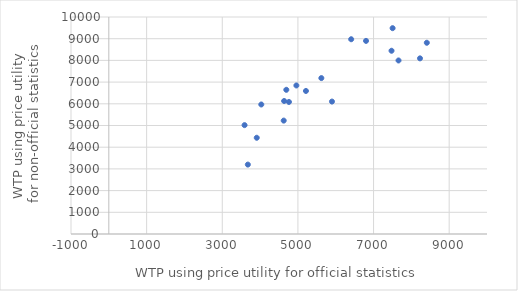
| Category | Series 0 |
|---|---|
| 4624.746085600304 | 5225.88 |
| 3911.6695905452307 | 4435.017 |
| 5900.867249253374 | 6103.217 |
| 4762.731070256099 | 6084.536 |
| 4635.849263185604 | 6128.985 |
| 5212.364453039598 | 6591.582 |
| 5619.855401473628 | 7184.896 |
| 7475.496682473595 | 8444.701 |
| 4031.7217765683854 | 5968.187 |
| 3589.3833462560515 | 5017.13 |
| 7660.616102369655 | 7996.941 |
| 6801.298396705039 | 8899.195 |
| 8408.52076374748 | 8813.107 |
| 4959.605618757788 | 6844.917 |
| 8228.26788636871 | 8094.342 |
| 6408.49581903948 | 8975.076 |
| 7504.11314232619 | 9485.201 |
| 4693.296839805444 | 6644.969 |
| 3676.12544335565 | 3198.754 |